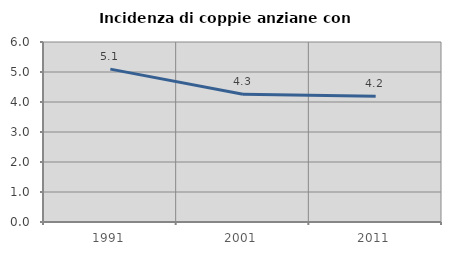
| Category | Incidenza di coppie anziane con figli |
|---|---|
| 1991.0 | 5.096 |
| 2001.0 | 4.26 |
| 2011.0 | 4.193 |